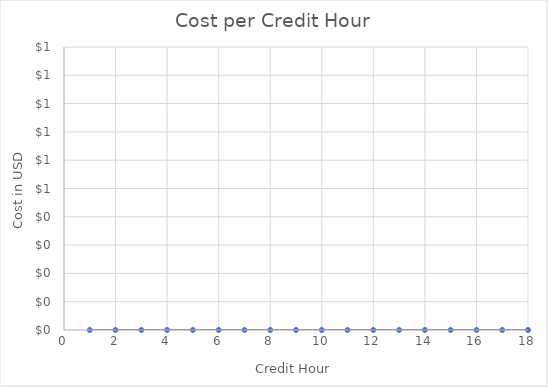
| Category | Cost |
|---|---|
| 1.0 | 0 |
| 2.0 | 0 |
| 3.0 | 0 |
| 4.0 | 0 |
| 5.0 | 0 |
| 6.0 | 0 |
| 7.0 | 0 |
| 8.0 | 0 |
| 9.0 | 0 |
| 10.0 | 0 |
| 11.0 | 0 |
| 12.0 | 0 |
| 13.0 | 0 |
| 14.0 | 0 |
| 15.0 | 0 |
| 16.0 | 0 |
| 17.0 | 0 |
| 18.0 | 0 |